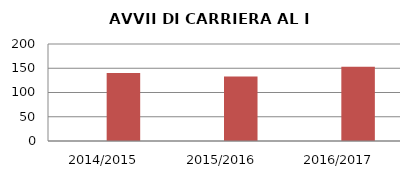
| Category | ANNO | NUMERO |
|---|---|---|
| 2014/2015 | 0 | 140 |
| 2015/2016 | 0 | 133 |
| 2016/2017 | 0 | 153 |